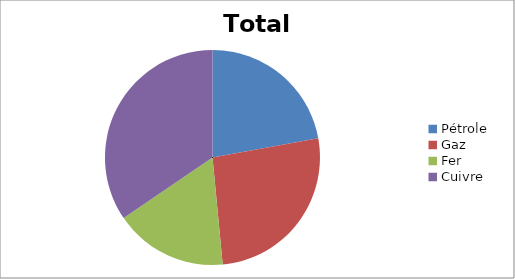
| Category | Total Année  |
|---|---|
| Pétrole     | 168 |
| Gaz | 200 |
| Fer | 129 |
| Cuivre | 262 |